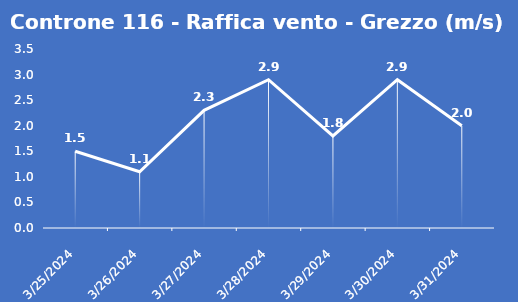
| Category | Controne 116 - Raffica vento - Grezzo (m/s) |
|---|---|
| 3/25/24 | 1.5 |
| 3/26/24 | 1.1 |
| 3/27/24 | 2.3 |
| 3/28/24 | 2.9 |
| 3/29/24 | 1.8 |
| 3/30/24 | 2.9 |
| 3/31/24 | 2 |